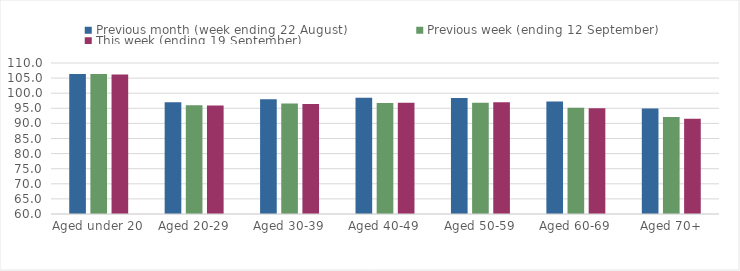
| Category | Previous month (week ending 22 August) | Previous week (ending 12 September) | This week (ending 19 September) |
|---|---|---|---|
| Aged under 20 | 106.36 | 106.35 | 106.18 |
| Aged 20-29 | 97.04 | 95.98 | 95.91 |
| Aged 30-39 | 98.02 | 96.59 | 96.41 |
| Aged 40-49 | 98.5 | 96.79 | 96.8 |
| Aged 50-59 | 98.43 | 96.84 | 96.98 |
| Aged 60-69 | 97.23 | 95.22 | 95.03 |
| Aged 70+ | 94.97 | 92.13 | 91.55 |